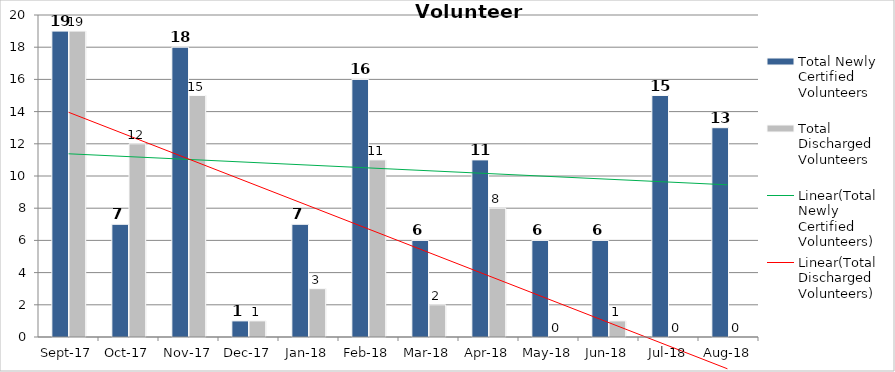
| Category | Total Newly Certified Volunteers | Total Discharged Volunteers |
|---|---|---|
| 2017-09-01 | 19 | 19 |
| 2017-10-01 | 7 | 12 |
| 2017-11-01 | 18 | 15 |
| 2017-12-01 | 1 | 1 |
| 2018-01-01 | 7 | 3 |
| 2018-02-01 | 16 | 11 |
| 2018-03-01 | 6 | 2 |
| 2018-04-01 | 11 | 8 |
| 2018-05-01 | 6 | 0 |
| 2018-06-01 | 6 | 1 |
| 2018-07-01 | 15 | 0 |
| 2018-08-01 | 13 | 0 |